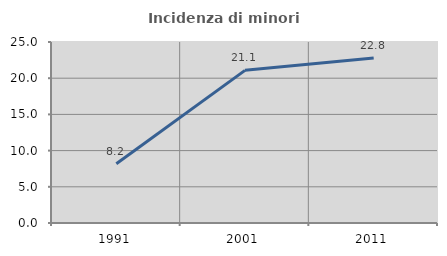
| Category | Incidenza di minori stranieri |
|---|---|
| 1991.0 | 8.184 |
| 2001.0 | 21.084 |
| 2011.0 | 22.798 |